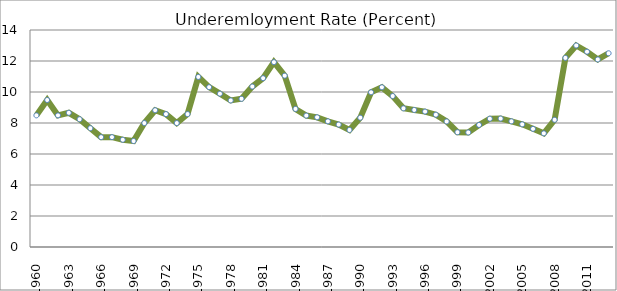
| Category | Series 0 |
|---|---|
| 1960.0 | 8.492 |
| 1961.0 | 9.484 |
| 1962.0 | 8.492 |
| 1963.0 | 8.657 |
| 1964.0 | 8.244 |
| 1965.0 | 7.665 |
| 1966.0 | 7.086 |
| 1967.0 | 7.086 |
| 1968.0 | 6.92 |
| 1969.0 | 6.838 |
| 1970.0 | 7.996 |
| 1971.0 | 8.823 |
| 1972.0 | 8.574 |
| 1973.0 | 7.996 |
| 1974.0 | 8.574 |
| 1975.0 | 10.972 |
| 1976.0 | 10.311 |
| 1977.0 | 9.891 |
| 1978.0 | 9.456 |
| 1979.0 | 9.56 |
| 1980.0 | 10.351 |
| 1981.0 | 10.892 |
| 1982.0 | 11.924 |
| 1983.0 | 11.053 |
| 1984.0 | 8.907 |
| 1985.0 | 8.479 |
| 1986.0 | 8.366 |
| 1987.0 | 8.108 |
| 1988.0 | 7.898 |
| 1989.0 | 7.551 |
| 1990.0 | 8.342 |
| 1991.0 | 9.98 |
| 1992.0 | 10.303 |
| 1993.0 | 9.738 |
| 1994.0 | 8.947 |
| 1995.0 | 8.842 |
| 1996.0 | 8.737 |
| 1997.0 | 8.536 |
| 1998.0 | 8.1 |
| 1999.0 | 7.406 |
| 2000.0 | 7.389 |
| 2001.0 | 7.874 |
| 2002.0 | 8.277 |
| 2003.0 | 8.285 |
| 2004.0 | 8.108 |
| 2005.0 | 7.914 |
| 2006.0 | 7.624 |
| 2007.0 | 7.333 |
| 2008.0 | 8.205 |
| 2009.0 | 12.2 |
| 2010.0 | 13 |
| 2011.0 | 12.6 |
| 2012.0 | 12.1 |
| 2013.0 | 12.5 |